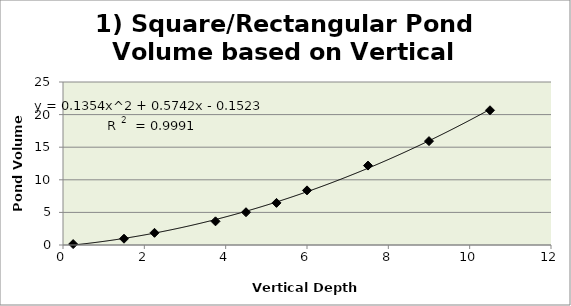
| Category | Series 0 |
|---|---|
| 0.25 | 0.141 |
| 1.5 | 0.965 |
| 2.25 | 1.869 |
| 3.75 | 3.632 |
| 4.5 | 5.026 |
| 5.25 | 6.458 |
| 6.0 | 8.38 |
| 7.5 | 12.183 |
| 9.0 | 15.932 |
| 10.5 | 20.665 |